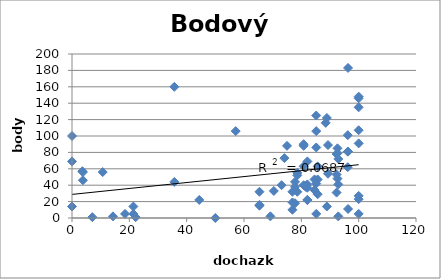
| Category | body |
|---|---|
| 70.4 | 33 |
| 100.0 | 135 |
| 92.6 | 79 |
| 85.2 | 42 |
| 100.0 | 27 |
| 88.9 | 14 |
| 96.3 | 183 |
| 85.2 | 5 |
| 96.3 | 11 |
| 85.2 | 86 |
| 92.6 | 85 |
| 100.0 | 146 |
| 77.8 | 18 |
| 44.4 | 22 |
| 77.8 | 38 |
| 88.9 | 122 |
| 92.6 | 48 |
| 18.5 | 5 |
| 81.5 | 38 |
| 96.3 | 81 |
| 85.2 | 125 |
| 85.2 | 106 |
| 77.8 | 44 |
| 100.0 | 107 |
| 74.1 | 73 |
| 22.2 | 1 |
| 10.7 | 56 |
| 21.4 | 5 |
| 85.7 | 47 |
| 85.7 | 63 |
| 100.0 | 23 |
| 0.0 | 100 |
| 35.7 | 160 |
| 50.0 | 0 |
| 100.0 | 5 |
| 78.6 | 32 |
| 3.6 | 57 |
| 7.1 | 1 |
| 89.3 | 89 |
| 82.1 | 22 |
| 21.4 | 14 |
| 82.1 | 22 |
| 0.0 | 14 |
| 35.7 | 44 |
| 85.7 | 29 |
| 0.0 | 69 |
| 92.9 | 72 |
| 57.1 | 106 |
| 82.1 | 37 |
| 82.1 | 41 |
| 92.9 | 41 |
| 82.1 | 69 |
| 92.9 | 2 |
| 75.0 | 88 |
| 100.0 | 148 |
| 78.6 | 55 |
| 78.6 | 52 |
| 100.0 | 91 |
| 89.3 | 54 |
| 14.3 | 2 |
| 69.2 | 2 |
| 96.2 | 62 |
| 3.8 | 46 |
| 80.8 | 63 |
| 96.2 | 101 |
| 80.8 | 88 |
| 76.9 | 32 |
| 3.8 | 56 |
| 88.5 | 116 |
| 80.8 | 90 |
| 84.6 | 47 |
| 65.4 | 32 |
| 92.3 | 78 |
| 92.3 | 31 |
| 76.9 | 10 |
| 80.8 | 40 |
| 65.4 | 15 |
| 92.3 | 53 |
| 65.4 | 16 |
| 73.1 | 40 |
| 76.9 | 19 |
| 84.6 | 34 |
| 96.2 | 81 |